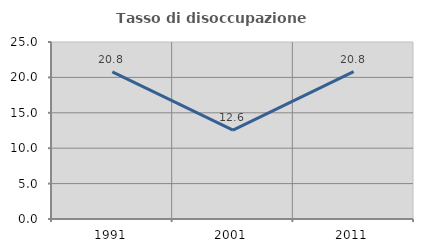
| Category | Tasso di disoccupazione giovanile  |
|---|---|
| 1991.0 | 20.776 |
| 2001.0 | 12.554 |
| 2011.0 | 20.805 |